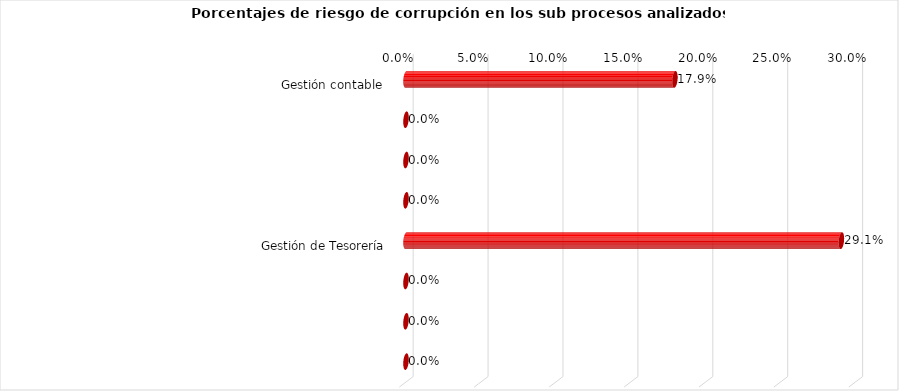
| Category | Series 0 |
|---|---|
| Gestión contable  | 0.179 |
|  | 0 |
|  | 0 |
|  | 0 |
| Gestión de Tesorería | 0.291 |